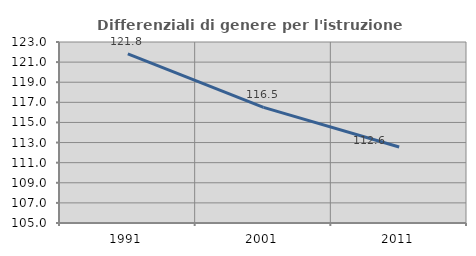
| Category | Differenziali di genere per l'istruzione superiore |
|---|---|
| 1991.0 | 121.812 |
| 2001.0 | 116.501 |
| 2011.0 | 112.554 |